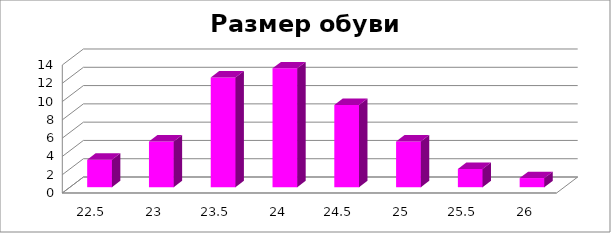
| Category | 22,5 23 23,5 24 24,5 25 25,5 26 |
|---|---|
| 22.5 | 3 |
| 23.0 | 5 |
| 23.5 | 12 |
| 24.0 | 13 |
| 24.5 | 9 |
| 25.0 | 5 |
| 25.5 | 2 |
| 26.0 | 1 |